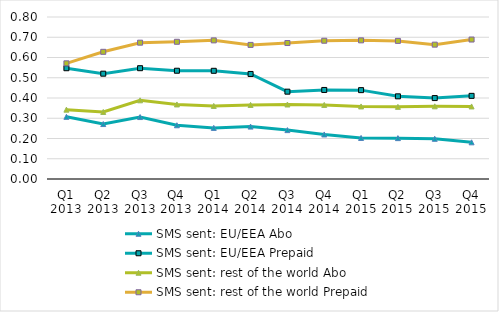
| Category | SMS sent: EU/EEA | SMS sent: rest of the world |
|---|---|---|
| Q1 2013 | 0.547 | 0.571 |
| Q2 2013 | 0.52 | 0.628 |
| Q3 2013 | 0.547 | 0.673 |
| Q4 2013 | 0.535 | 0.678 |
| Q1 2014 | 0.534 | 0.685 |
| Q2 2014 | 0.519 | 0.662 |
| Q3 2014 | 0.431 | 0.672 |
| Q4 2014 | 0.44 | 0.683 |
| Q1 2015 | 0.439 | 0.685 |
| Q2 2015 | 0.408 | 0.682 |
| Q3 2015 | 0.4 | 0.663 |
| Q4 2015 | 0.411 | 0.689 |